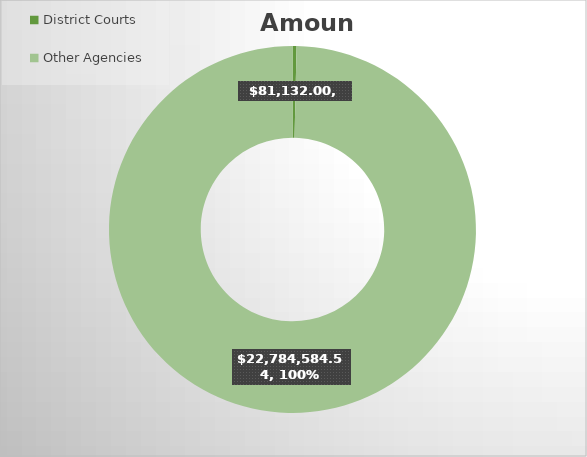
| Category | Amount |
|---|---|
| District Courts | 81132 |
| Other Agencies | 22784584.54 |